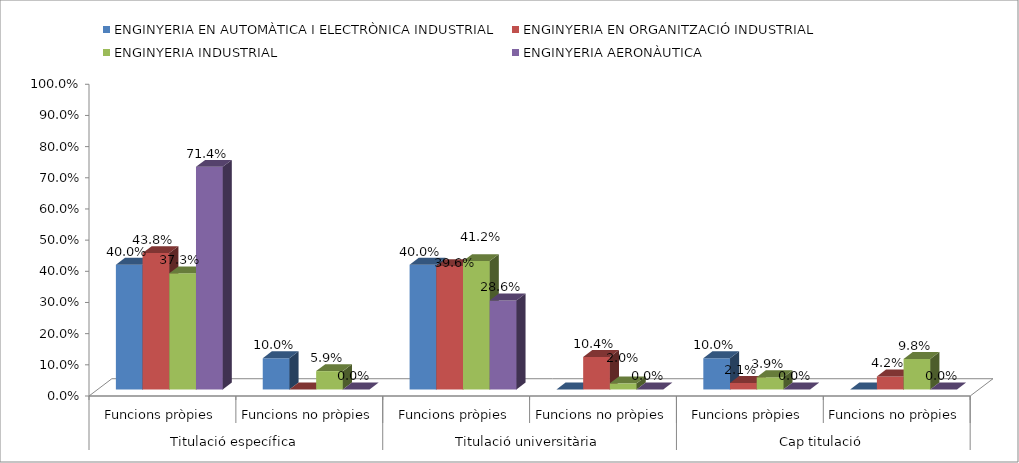
| Category | ENGINYERIA EN AUTOMÀTICA I ELECTRÒNICA INDUSTRIAL | ENGINYERIA EN ORGANITZACIÓ INDUSTRIAL | ENGINYERIA INDUSTRIAL | ENGINYERIA AERONÀUTICA |
|---|---|---|---|---|
| 0 | 0.4 | 0.438 | 0.373 | 0.714 |
| 1 | 0.1 | 0 | 0.059 | 0 |
| 2 | 0.4 | 0.396 | 0.412 | 0.286 |
| 3 | 0 | 0.104 | 0.02 | 0 |
| 4 | 0.1 | 0.021 | 0.039 | 0 |
| 5 | 0 | 0.042 | 0.098 | 0 |